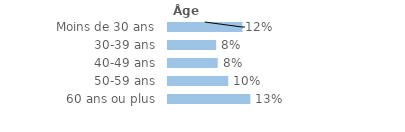
| Category | Series 0 |
|---|---|
| Moins de 30 ans | 0.118 |
| 30-39 ans | 0.076 |
| 40-49 ans | 0.079 |
| 50-59 ans | 0.096 |
| 60 ans ou plus | 0.131 |